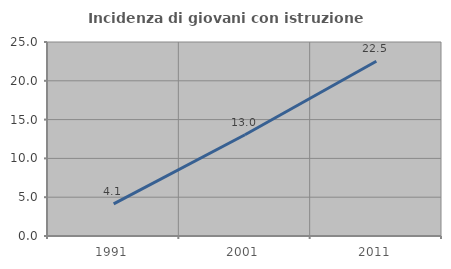
| Category | Incidenza di giovani con istruzione universitaria |
|---|---|
| 1991.0 | 4.132 |
| 2001.0 | 13.043 |
| 2011.0 | 22.523 |